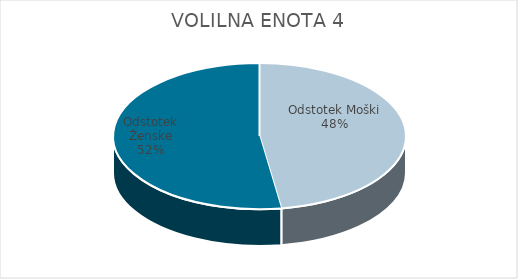
| Category | VOLILNA ENOTA 4 | #REF! | Slovenija skupaj |
|---|---|---|---|
| Odstotek Moški | 34.42 |  | 33.67 |
| Odstotek Ženske | 37.85 |  | 35.97 |